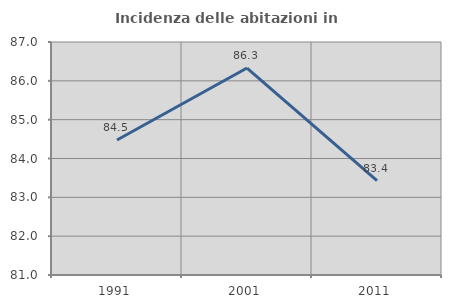
| Category | Incidenza delle abitazioni in proprietà  |
|---|---|
| 1991.0 | 84.477 |
| 2001.0 | 86.329 |
| 2011.0 | 83.429 |